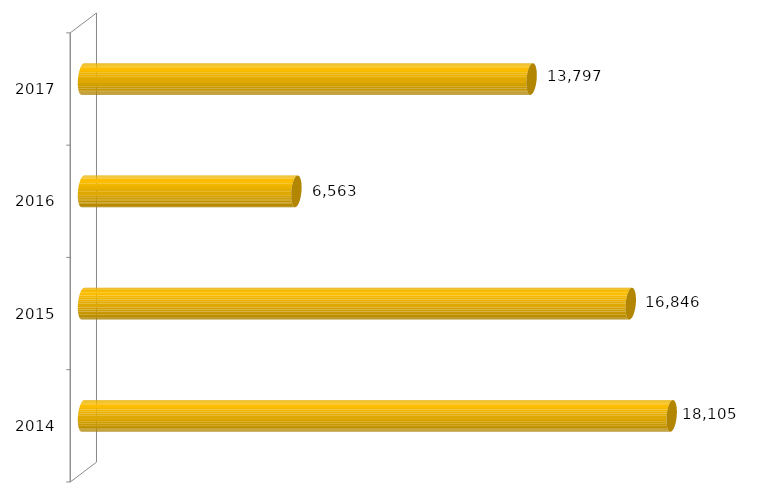
| Category | Inscritos |
|---|---|
| 2014.0 | 18105 |
| 2015.0 | 16846 |
| 2016.0 | 6563 |
| 2017.0 | 13797 |